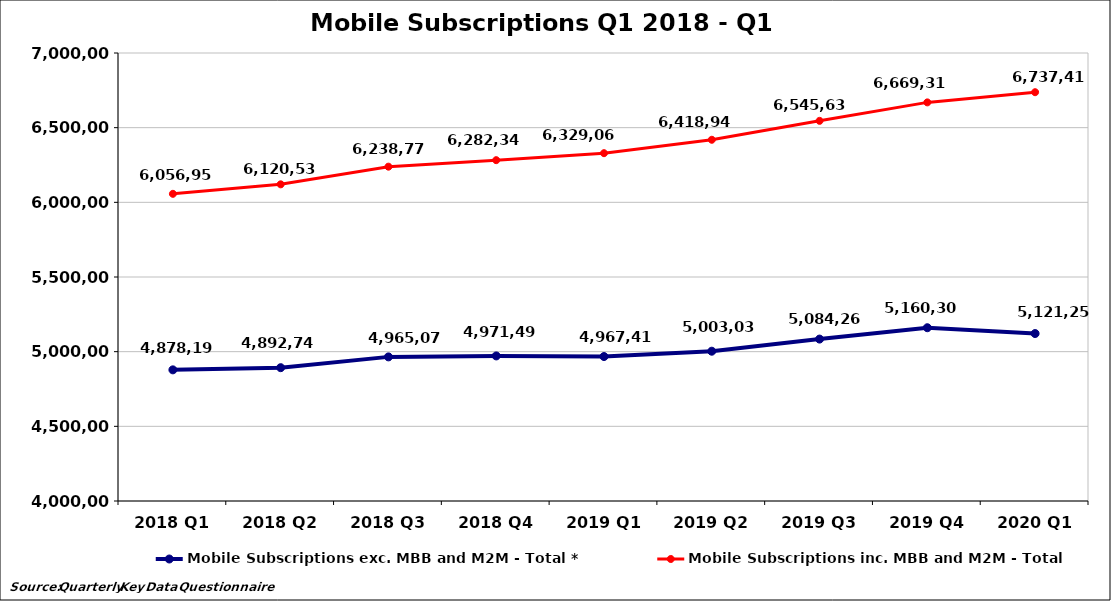
| Category | Mobile Subscriptions exc. MBB and M2M - Total * | Mobile Subscriptions inc. MBB and M2M - Total |
|---|---|---|
| 2018 Q1 | 4878194 | 6056957 |
| 2018 Q2 | 4892745 | 6120535 |
| 2018 Q3 | 4965077 | 6238772 |
| 2018 Q4 | 4971493 | 6282346 |
| 2019 Q1 | 4967414 | 6329068 |
| 2019 Q2 | 5003030 | 6418948 |
| 2019 Q3 | 5084265 | 6545636 |
| 2019 Q4 | 5160309 | 6669317 |
| 2020 Q1 | 5121253 | 6737414 |